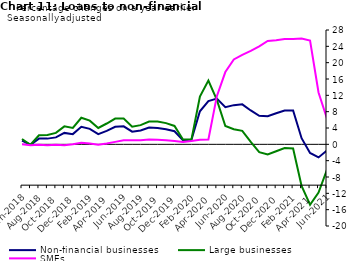
| Category | zero | Non-financial businesses | Large businesses | SMEs |
|---|---|---|---|---|
| Jun-2018 | 0 | 0.9 | 1.3 | 0 |
| Jul-2018 | 0 | -0.1 | -0.1 | -0.2 |
| Aug-2018 | 0 | 1.4 | 2.2 | -0.1 |
| Sep-2018 | 0 | 1.4 | 2.3 | -0.2 |
| Oct-2018 | 0 | 1.7 | 2.8 | -0.1 |
| Nov-2018 | 0 | 2.8 | 4.4 | -0.2 |
| Dec-2018 | 0 | 2.5 | 4 | 0 |
| Jan-2019 | 0 | 4.3 | 6.5 | 0.4 |
| Feb-2019 | 0 | 3.8 | 5.8 | 0.2 |
| Mar-2019 | 0 | 2.5 | 4 | -0.1 |
| Apr-2019 | 0 | 3.3 | 5.1 | 0.2 |
| May-2019 | 0 | 4.3 | 6.3 | 0.6 |
| Jun-2019 | 0 | 4.4 | 6.3 | 1 |
| Jul-2019 | 0 | 3.1 | 4.3 | 1 |
| Aug-2019 | 0 | 3.4 | 4.7 | 1 |
| Sep-2019 | 0 | 4.1 | 5.6 | 1.2 |
| Oct-2019 | 0 | 4 | 5.6 | 1.1 |
| Nov-2019 | 0 | 3.7 | 5.2 | 1 |
| Dec-2019 | 0 | 3.2 | 4.5 | 0.8 |
| Jan-2020 | 0 | 1 | 1.2 | 0.6 |
| Feb-2020 | 0 | 1.1 | 1.2 | 0.8 |
| Mar-2020 | 0 | 8.1 | 11.7 | 1.1 |
| Apr-2020 | 0 | 10.6 | 15.6 | 1.2 |
| May-2020 | 0 | 11.2 | 10.9 | 11.8 |
| Jun-2020 | 0 | 9.1 | 4.5 | 17.7 |
| Jul-2020 | 0 | 9.6 | 3.7 | 20.8 |
| Aug-2020 | 0 | 9.8 | 3.3 | 21.9 |
| Sep-2020 | 0 | 8.3 | 0.6 | 22.9 |
| Oct-2020 | 0 | 7 | -1.9 | 24 |
| Nov-2020 | 0 | 6.9 | -2.5 | 25.3 |
| Dec-2020 | 0 | 7.6 | -1.7 | 25.5 |
| Jan-2021 | 0 | 8.3 | -0.9 | 25.8 |
| Feb-2021 | 0 | 8.3 | -1 | 25.8 |
| Mar-2021 | 0 | 1.5 | -10.2 | 25.9 |
| Apr-2021 | 0 | -2.1 | -14.8 | 25.4 |
| May-2021 | 0 | -3.2 | -11.8 | 12.7 |
| Jun-2021 | 0 | -1.5 | -6.2 | 6.3 |